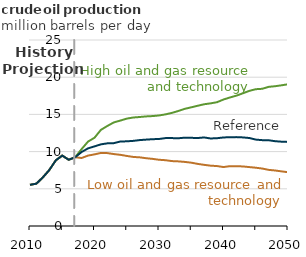
| Category | High oil and gas resource and technology | Low oil and gas resource and technology | Reference |
|---|---|---|---|
| 2010.0 | 5.533 | 5.533 | 5.533 |
| 2011.0 | 5.697 | 5.697 | 5.697 |
| 2012.0 | 6.542 | 6.542 | 6.542 |
| 2013.0 | 7.531 | 7.531 | 7.531 |
| 2014.0 | 8.828 | 8.828 | 8.828 |
| 2015.0 | 9.465 | 9.465 | 9.465 |
| 2016.0 | 8.904 | 8.904 | 8.904 |
| 2017.0 | 9.243 | 9.243 | 9.243 |
| 2018.0 | 10.338 | 9.14 | 9.946 |
| 2019.0 | 11.346 | 9.464 | 10.437 |
| 2020.0 | 11.863 | 9.628 | 10.702 |
| 2021.0 | 12.926 | 9.823 | 10.976 |
| 2022.0 | 13.45 | 9.796 | 11.11 |
| 2023.0 | 13.926 | 9.669 | 11.134 |
| 2024.0 | 14.169 | 9.568 | 11.356 |
| 2025.0 | 14.432 | 9.418 | 11.381 |
| 2026.0 | 14.582 | 9.283 | 11.442 |
| 2027.0 | 14.65 | 9.23 | 11.546 |
| 2028.0 | 14.73 | 9.111 | 11.61 |
| 2029.0 | 14.775 | 9.023 | 11.666 |
| 2030.0 | 14.857 | 8.903 | 11.696 |
| 2031.0 | 15.002 | 8.844 | 11.814 |
| 2032.0 | 15.202 | 8.725 | 11.815 |
| 2033.0 | 15.46 | 8.686 | 11.794 |
| 2034.0 | 15.748 | 8.614 | 11.871 |
| 2035.0 | 15.952 | 8.511 | 11.852 |
| 2036.0 | 16.161 | 8.348 | 11.825 |
| 2037.0 | 16.364 | 8.219 | 11.902 |
| 2038.0 | 16.484 | 8.11 | 11.765 |
| 2039.0 | 16.641 | 8.056 | 11.801 |
| 2040.0 | 17.002 | 7.924 | 11.898 |
| 2041.0 | 17.275 | 8.044 | 11.939 |
| 2042.0 | 17.52 | 8.042 | 11.946 |
| 2043.0 | 17.837 | 8.005 | 11.909 |
| 2044.0 | 18.162 | 7.92 | 11.826 |
| 2045.0 | 18.386 | 7.834 | 11.615 |
| 2046.0 | 18.441 | 7.724 | 11.539 |
| 2047.0 | 18.703 | 7.545 | 11.526 |
| 2048.0 | 18.788 | 7.462 | 11.399 |
| 2049.0 | 18.91 | 7.341 | 11.333 |
| 2050.0 | 19.05 | 7.23 | 11.301 |